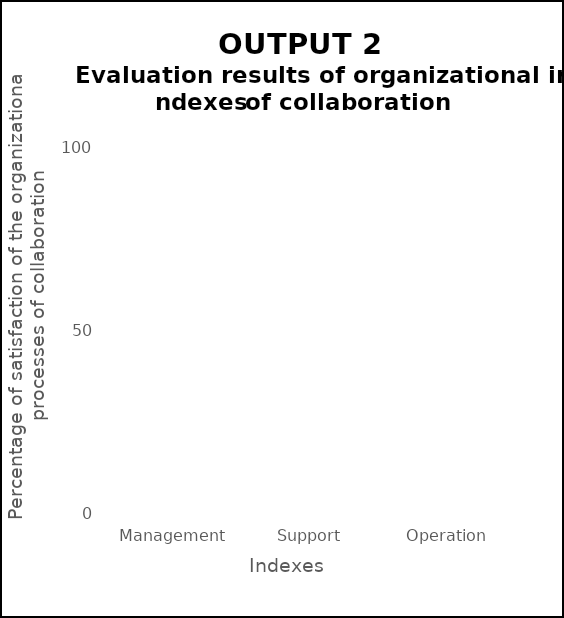
| Category | Series 0 |
|---|---|
| Management | 0 |
| Support | 0 |
| Operation | 0 |